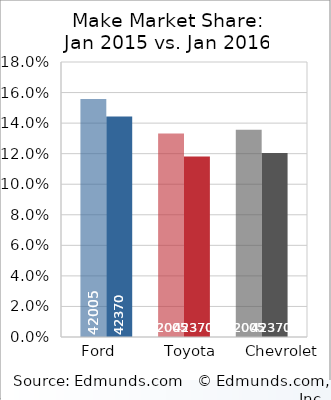
| Category | Ford | Series 4 | Toyota | Series 5 | Chevrolet |
|---|---|---|---|---|---|
| 0 | 0.144 |  | 0.118 |  | 0.12 |